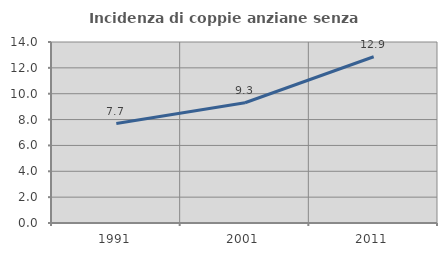
| Category | Incidenza di coppie anziane senza figli  |
|---|---|
| 1991.0 | 7.692 |
| 2001.0 | 9.302 |
| 2011.0 | 12.857 |